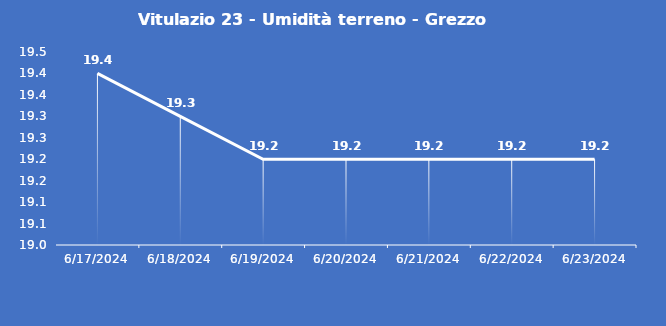
| Category | Vitulazio 23 - Umidità terreno - Grezzo (%VWC) |
|---|---|
| 6/17/24 | 19.4 |
| 6/18/24 | 19.3 |
| 6/19/24 | 19.2 |
| 6/20/24 | 19.2 |
| 6/21/24 | 19.2 |
| 6/22/24 | 19.2 |
| 6/23/24 | 19.2 |